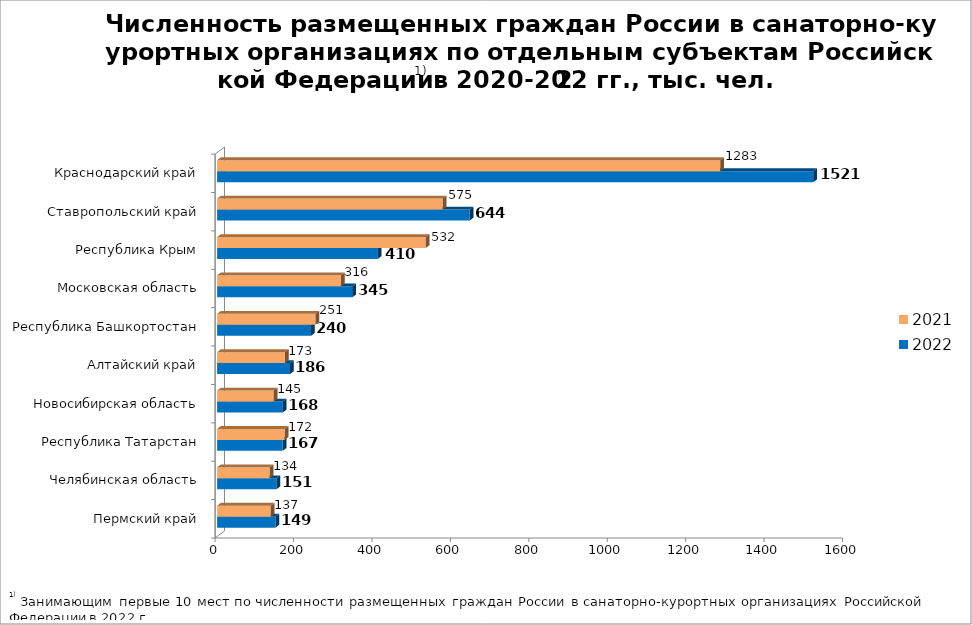
| Category | 2022 | 2021 |
|---|---|---|
| Пермский край | 148.602 | 136.922 |
| Челябинская область | 151.345 | 133.893 |
| Республика Татарстан | 167.081 | 172.177 |
| Новосибирская область | 167.556 | 144.715 |
| Алтайский край | 185.911 | 172.996 |
| Республика Башкортостан | 239.689 | 250.71 |
| Московская область | 344.812 | 315.763 |
| Республика Крым | 409.771 | 532.028 |
| Ставропольский край | 644.161 | 575.255 |
| Краснодарский край | 1520.513 | 1283.023 |